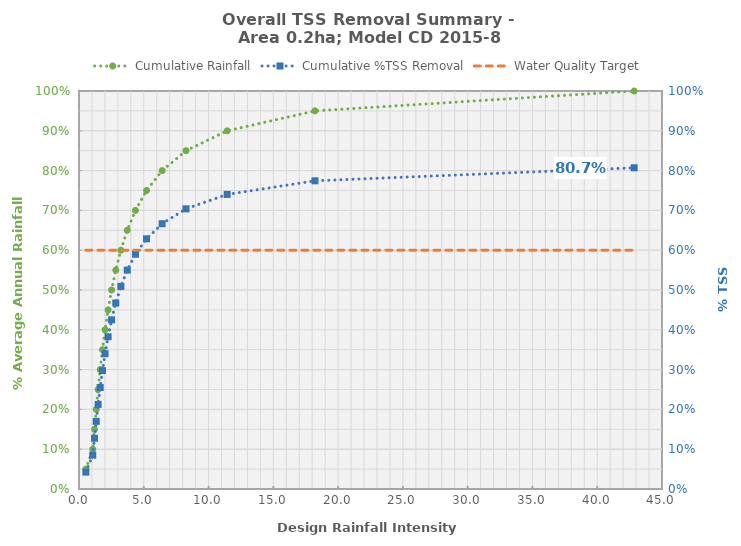
| Category | Cumulative Rainfall |
|---|---|
| 0.5309250472649101 | 0.05 |
| 1.0618500945298202 | 0.1 |
| 1.1946080246872006 | 0.15 |
| 1.3310751428751357 | 0.2 |
| 1.476681261601412 | 0.25 |
| 1.6358466113766068 | 0.3 |
| 1.8131500277406876 | 0.35 |
| 2.0139907687456744 | 0.4 |
| 2.245225681203148 | 0.45 |
| 2.516005802426156 | 0.5 |
| 2.839049177583629 | 0.55 |
| 3.232741685731252 | 0.6 |
| 3.724835460241191 | 0.65 |
| 4.359412602308802 | 0.7 |
| 5.211091668389964 | 0.75 |
| 6.417136992380095 | 0.8 |
| 8.260817704139464 | 0.85 |
| 11.436069312096867 | 0.9 |
| 18.215144079756033 | 0.95 |
| 42.85210969932864 | 1 |